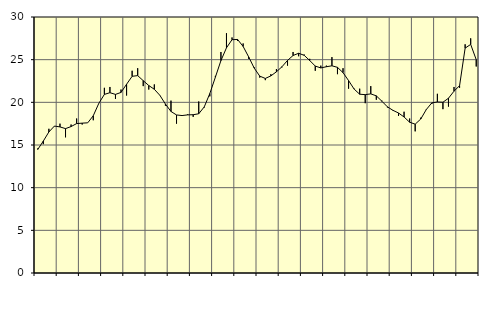
| Category | Piggar | Series 1 |
|---|---|---|
| nan | 14.6 | 14.48 |
| 1.0 | 15.1 | 15.46 |
| 1.0 | 16.9 | 16.53 |
| 1.0 | 17.2 | 17.22 |
| nan | 17.5 | 17.12 |
| 2.0 | 15.9 | 16.92 |
| 2.0 | 17.4 | 17.16 |
| 2.0 | 18.1 | 17.51 |
| nan | 17.4 | 17.56 |
| 3.0 | 17.6 | 17.6 |
| 3.0 | 17.9 | 18.43 |
| 3.0 | 19.9 | 19.88 |
| nan | 21.7 | 20.93 |
| 4.0 | 21.8 | 21.13 |
| 4.0 | 20.4 | 20.93 |
| 4.0 | 21.5 | 21.16 |
| nan | 20.8 | 22.12 |
| 5.0 | 23.7 | 23.05 |
| 5.0 | 24 | 23.13 |
| 5.0 | 21.9 | 22.54 |
| nan | 21.5 | 21.97 |
| 6.0 | 22.1 | 21.53 |
| 6.0 | 20.8 | 20.82 |
| 6.0 | 19.6 | 19.8 |
| nan | 20.2 | 18.93 |
| 7.0 | 17.5 | 18.52 |
| 7.0 | 18.4 | 18.45 |
| 7.0 | 18.6 | 18.53 |
| nan | 18.3 | 18.55 |
| 8.0 | 20.1 | 18.66 |
| 8.0 | 19.4 | 19.47 |
| 8.0 | 20.7 | 21.03 |
| nan | 23.1 | 22.95 |
| 9.0 | 25.9 | 24.89 |
| 9.0 | 28.1 | 26.39 |
| 9.0 | 27.6 | 27.34 |
| nan | 27.2 | 27.37 |
| 10.0 | 26.9 | 26.55 |
| 10.0 | 25.1 | 25.32 |
| 10.0 | 24.1 | 24.01 |
| nan | 22.9 | 23.07 |
| 11.0 | 22.6 | 22.8 |
| 11.0 | 23.3 | 23.1 |
| 11.0 | 23.9 | 23.58 |
| nan | 24.1 | 24.17 |
| 12.0 | 24.3 | 24.91 |
| 12.0 | 25.9 | 25.49 |
| 12.0 | 25.4 | 25.75 |
| nan | 25.6 | 25.51 |
| 13.0 | 25.1 | 24.9 |
| 13.0 | 23.7 | 24.25 |
| 13.0 | 24.3 | 24.03 |
| nan | 24.3 | 24.17 |
| 14.0 | 25.3 | 24.28 |
| 14.0 | 23.3 | 24.1 |
| 14.0 | 24 | 23.48 |
| nan | 21.6 | 22.55 |
| 15.0 | 21.6 | 21.55 |
| 15.0 | 21.6 | 20.95 |
| 15.0 | 19.9 | 20.9 |
| nan | 21.9 | 20.99 |
| 16.0 | 20.3 | 20.76 |
| 16.0 | 20.2 | 20.13 |
| 16.0 | 19.4 | 19.47 |
| nan | 19.1 | 19.06 |
| 17.0 | 18.4 | 18.75 |
| 17.0 | 18.9 | 18.28 |
| 17.0 | 18.1 | 17.67 |
| nan | 16.6 | 17.44 |
| 18.0 | 18.2 | 18.04 |
| 18.0 | 19.2 | 19.15 |
| 18.0 | 19.8 | 19.94 |
| nan | 21 | 20.04 |
| 19.0 | 19.2 | 20.01 |
| 19.0 | 19.5 | 20.48 |
| 19.0 | 21.8 | 21.31 |
| nan | 21.7 | 21.95 |
| 20.0 | 26.8 | 26.35 |
| 20.0 | 27.5 | 26.79 |
| 20.0 | 24.2 | 25 |